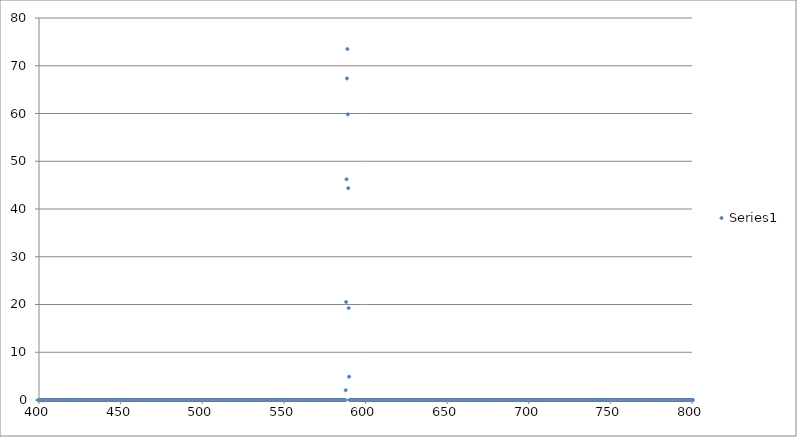
| Category | Series 0 |
|---|---|
| 373.66 | 0 |
| 373.92 | 0 |
| 374.18 | 0 |
| 374.44 | 0 |
| 374.7 | 0 |
| 374.96 | 0 |
| 375.22 | 0 |
| 375.48 | 0 |
| 375.74 | 0 |
| 376.0 | 0 |
| 376.26 | 0 |
| 376.52 | 0 |
| 376.78 | 0 |
| 377.04 | 0 |
| 377.3 | 0 |
| 377.56 | 0 |
| 377.82 | 0 |
| 378.08 | 0 |
| 378.34 | 0 |
| 378.6 | 0 |
| 378.86 | 0 |
| 379.12 | 0 |
| 379.38 | 0 |
| 379.64 | 0 |
| 379.9 | 0 |
| 380.16 | 0 |
| 380.42 | 0 |
| 380.68 | 0 |
| 380.94 | 0 |
| 381.2 | 0 |
| 381.46 | 0 |
| 381.72 | 0 |
| 381.98 | 0 |
| 382.24 | 0 |
| 382.5 | 0 |
| 382.76 | 0 |
| 383.02 | 0 |
| 383.28 | 0 |
| 383.54 | 0 |
| 383.8 | 0 |
| 384.06 | 0 |
| 384.32 | 0 |
| 384.58 | 0 |
| 384.84 | 0 |
| 385.1 | 0 |
| 385.36 | 0 |
| 385.62 | 0 |
| 385.88 | 0 |
| 386.14 | 0 |
| 386.4 | 0 |
| 386.66 | 0 |
| 386.92 | 0 |
| 387.18 | 0 |
| 387.44 | 0 |
| 387.7 | 0 |
| 387.96 | 0 |
| 388.22 | 0 |
| 388.48 | 0 |
| 388.74 | 0 |
| 389.0 | 0 |
| 389.26 | 0 |
| 389.52 | 0 |
| 389.78 | 0 |
| 390.04 | 0 |
| 390.3 | 0 |
| 390.56 | 0 |
| 390.82 | 0 |
| 391.08 | 0 |
| 391.34 | 0 |
| 391.6 | 0 |
| 391.86 | 0 |
| 392.12 | 0 |
| 392.38 | 0 |
| 392.64 | 0 |
| 392.9 | 0 |
| 393.16 | 0 |
| 393.42 | 0 |
| 393.68 | 0 |
| 393.94 | 0 |
| 394.2 | 0 |
| 394.46 | 0 |
| 394.72 | 0 |
| 394.98 | 0 |
| 395.24 | 0 |
| 395.5 | 0 |
| 395.76 | 0 |
| 396.02 | 0 |
| 396.28 | 0 |
| 396.54 | 0 |
| 396.8 | 0 |
| 397.06 | 0 |
| 397.32 | 0 |
| 397.58 | 0 |
| 397.84 | 0 |
| 398.1 | 0 |
| 398.36 | 0 |
| 398.62 | 0 |
| 398.88 | 0 |
| 399.14 | 0 |
| 399.4 | 0 |
| 399.66 | 0 |
| 399.92 | 0 |
| 400.18 | 0 |
| 400.44 | 0 |
| 400.7 | 0 |
| 400.96 | 0 |
| 401.22 | 0 |
| 401.48 | 0 |
| 401.74 | 0 |
| 402.0 | 0 |
| 402.26 | 0 |
| 402.52 | 0 |
| 402.78 | 0 |
| 403.04 | 0 |
| 403.3 | 0 |
| 403.56 | 0 |
| 403.82 | 0 |
| 404.08 | 0 |
| 404.34 | 0 |
| 404.6 | 0 |
| 404.86 | 0 |
| 405.12 | 0 |
| 405.38 | 0 |
| 405.64 | 0 |
| 405.9 | 0 |
| 406.16 | 0 |
| 406.42 | 0 |
| 406.68 | 0 |
| 406.94 | 0 |
| 407.2 | 0 |
| 407.46 | 0 |
| 407.72 | 0 |
| 407.98 | 0 |
| 408.24 | 0 |
| 408.5 | 0 |
| 408.76 | 0 |
| 409.02 | 0 |
| 409.28 | 0 |
| 409.54 | 0 |
| 409.8 | 0 |
| 410.06 | 0 |
| 410.32 | 0 |
| 410.58 | 0 |
| 410.84 | 0 |
| 411.1 | 0 |
| 411.36 | 0 |
| 411.62 | 0 |
| 411.88 | 0 |
| 412.14 | 0 |
| 412.4 | 0 |
| 412.66 | 0 |
| 412.92 | 0 |
| 413.18 | 0 |
| 413.44 | 0 |
| 413.7 | 0 |
| 413.96 | 0 |
| 414.22 | 0 |
| 414.48 | 0 |
| 414.74 | 0 |
| 415.0 | 0 |
| 415.26 | 0 |
| 415.52 | 0 |
| 415.78 | 0 |
| 416.04 | 0 |
| 416.3 | 0 |
| 416.56 | 0 |
| 416.82 | 0 |
| 417.08 | 0 |
| 417.34 | 0 |
| 417.6 | 0 |
| 417.86 | 0 |
| 418.12 | 0 |
| 418.38 | 0 |
| 418.64 | 0 |
| 418.9 | 0 |
| 419.16 | 0 |
| 419.42 | 0 |
| 419.68 | 0 |
| 419.94 | 0 |
| 420.2 | 0 |
| 420.46 | 0 |
| 420.72 | 0 |
| 420.98 | 0 |
| 421.24 | 0 |
| 421.5 | 0 |
| 421.76 | 0 |
| 422.02 | 0 |
| 422.28 | 0 |
| 422.54 | 0 |
| 422.8 | 0 |
| 423.06 | 0 |
| 423.32 | 0 |
| 423.58 | 0 |
| 423.84 | 0 |
| 424.1 | 0 |
| 424.36 | 0 |
| 424.62 | 0 |
| 424.88 | 0 |
| 425.14 | 0 |
| 425.4 | 0 |
| 425.66 | 0 |
| 425.92 | 0 |
| 426.18 | 0 |
| 426.44 | 0 |
| 426.7 | 0 |
| 426.96 | 0 |
| 427.22 | 0 |
| 427.48 | 0 |
| 427.74 | 0 |
| 428.0 | 0 |
| 428.26 | 0 |
| 428.52 | 0 |
| 428.78 | 0 |
| 429.04 | 0 |
| 429.3 | 0 |
| 429.56 | 0 |
| 429.82 | 0 |
| 430.08 | 0 |
| 430.34 | 0 |
| 430.6 | 0 |
| 430.86 | 0 |
| 431.12 | 0 |
| 431.38 | 0 |
| 431.64 | 0 |
| 431.9 | 0 |
| 432.16 | 0 |
| 432.42 | 0 |
| 432.68 | 0 |
| 432.94 | 0 |
| 433.2 | 0 |
| 433.46 | 0 |
| 433.72 | 0 |
| 433.98 | 0 |
| 434.24 | 0 |
| 434.5 | 0 |
| 434.76 | 0 |
| 435.02 | 0 |
| 435.28 | 0 |
| 435.54 | 0 |
| 435.8 | 0 |
| 436.05 | 0 |
| 436.31 | 0 |
| 436.57 | 0 |
| 436.83 | 0 |
| 437.09 | 0 |
| 437.35 | 0 |
| 437.61 | 0 |
| 437.87 | 0 |
| 438.13 | 0 |
| 438.39 | 0 |
| 438.65 | 0 |
| 438.91 | 0 |
| 439.17 | 0 |
| 439.43 | 0 |
| 439.69 | 0 |
| 439.95 | 0 |
| 440.21 | 0 |
| 440.47 | 0 |
| 440.73 | 0 |
| 440.99 | 0 |
| 441.25 | 0 |
| 441.51 | 0 |
| 441.77 | 0 |
| 442.03 | 0 |
| 442.29 | 0 |
| 442.55 | 0 |
| 442.81 | 0 |
| 443.07 | 0 |
| 443.33 | 0 |
| 443.59 | 0 |
| 443.85 | 0 |
| 444.11 | 0 |
| 444.37 | 0 |
| 444.63 | 0 |
| 444.89 | 0 |
| 445.15 | 0 |
| 445.41 | 0 |
| 445.67 | 0 |
| 445.93 | 0 |
| 446.19 | 0 |
| 446.45 | 0 |
| 446.71 | 0 |
| 446.97 | 0 |
| 447.23 | 0 |
| 447.49 | 0 |
| 447.75 | 0 |
| 448.01 | 0 |
| 448.27 | 0 |
| 448.53 | 0 |
| 448.79 | 0 |
| 449.05 | 0 |
| 449.31 | 0 |
| 449.57 | 0 |
| 449.83 | 0 |
| 450.09 | 0 |
| 450.35 | 0 |
| 450.61 | 0 |
| 450.87 | 0 |
| 451.13 | 0 |
| 451.39 | 0 |
| 451.65 | 0 |
| 451.91 | 0 |
| 452.17 | 0 |
| 452.43 | 0 |
| 452.69 | 0 |
| 452.95 | 0 |
| 453.21 | 0 |
| 453.47 | 0 |
| 453.73 | 0 |
| 453.99 | 0 |
| 454.25 | 0 |
| 454.51 | 0 |
| 454.77 | 0 |
| 455.03 | 0 |
| 455.29 | 0 |
| 455.55 | 0 |
| 455.81 | 0 |
| 456.07 | 0 |
| 456.33 | 0 |
| 456.59 | 0 |
| 456.85 | 0 |
| 457.11 | 0 |
| 457.37 | 0 |
| 457.63 | 0 |
| 457.89 | 0 |
| 458.15 | 0 |
| 458.41 | 0 |
| 458.67 | 0 |
| 458.93 | 0 |
| 459.19 | 0 |
| 459.45 | 0 |
| 459.71 | 0 |
| 459.97 | 0 |
| 460.23 | 0 |
| 460.49 | 0 |
| 460.75 | 0 |
| 461.01 | 0 |
| 461.27 | 0 |
| 461.53 | 0 |
| 461.79 | 0 |
| 462.05 | 0 |
| 462.31 | 0 |
| 462.57 | 0 |
| 462.83 | 0 |
| 463.09 | 0 |
| 463.35 | 0 |
| 463.61 | 0 |
| 463.87 | 0 |
| 464.13 | 0 |
| 464.39 | 0 |
| 464.65 | 0 |
| 464.91 | 0 |
| 465.17 | 0 |
| 465.43 | 0 |
| 465.69 | 0 |
| 465.95 | 0 |
| 466.21 | 0 |
| 466.47 | 0 |
| 466.73 | 0 |
| 466.99 | 0 |
| 467.25 | 0 |
| 467.51 | 0 |
| 467.77 | 0 |
| 468.03 | 0 |
| 468.29 | 0 |
| 468.55 | 0 |
| 468.81 | 0 |
| 469.07 | 0 |
| 469.33 | 0 |
| 469.59 | 0 |
| 469.85 | 0 |
| 470.11 | 0 |
| 470.37 | 0 |
| 470.63 | 0 |
| 470.89 | 0 |
| 471.15 | 0 |
| 471.41 | 0 |
| 471.67 | 0 |
| 471.93 | 0 |
| 472.19 | 0 |
| 472.45 | 0 |
| 472.71 | 0 |
| 472.97 | 0 |
| 473.23 | 0 |
| 473.49 | 0 |
| 473.75 | 0 |
| 474.01 | 0 |
| 474.27 | 0 |
| 474.53 | 0 |
| 474.79 | 0 |
| 475.05 | 0 |
| 475.31 | 0 |
| 475.57 | 0 |
| 475.83 | 0 |
| 476.09 | 0 |
| 476.35 | 0 |
| 476.61 | 0 |
| 476.87 | 0 |
| 477.13 | 0 |
| 477.39 | 0 |
| 477.65 | 0 |
| 477.91 | 0 |
| 478.17 | 0 |
| 478.43 | 0 |
| 478.69 | 0 |
| 478.95 | 0 |
| 479.21 | 0 |
| 479.47 | 0 |
| 479.73 | 0 |
| 479.99 | 0 |
| 480.25 | 0 |
| 480.51 | 0 |
| 480.77 | 0 |
| 481.03 | 0 |
| 481.29 | 0 |
| 481.55 | 0 |
| 481.81 | 0 |
| 482.07 | 0 |
| 482.33 | 0 |
| 482.59 | 0 |
| 482.85 | 0 |
| 483.11 | 0 |
| 483.37 | 0 |
| 483.63 | 0 |
| 483.89 | 0 |
| 484.15 | 0 |
| 484.41 | 0 |
| 484.67 | 0 |
| 484.93 | 0 |
| 485.19 | 0 |
| 485.45 | 0 |
| 485.71 | 0 |
| 485.97 | 0 |
| 486.23 | 0 |
| 486.49 | 0 |
| 486.75 | 0 |
| 487.01 | 0 |
| 487.27 | 0 |
| 487.53 | 0 |
| 487.79 | 0 |
| 488.05 | 0 |
| 488.31 | 0 |
| 488.57 | 0 |
| 488.83 | 0 |
| 489.09 | 0 |
| 489.35 | 0 |
| 489.61 | 0 |
| 489.87 | 0 |
| 490.13 | 0 |
| 490.39 | 0 |
| 490.65 | 0 |
| 490.91 | 0 |
| 491.17 | 0 |
| 491.43 | 0 |
| 491.69 | 0 |
| 491.95 | 0 |
| 492.21 | 0 |
| 492.47 | 0 |
| 492.73 | 0 |
| 492.99 | 0 |
| 493.25 | 0 |
| 493.51 | 0 |
| 493.77 | 0 |
| 494.03 | 0 |
| 494.29 | 0 |
| 494.55 | 0 |
| 494.81 | 0 |
| 495.07 | 0 |
| 495.33 | 0 |
| 495.59 | 0 |
| 495.85 | 0 |
| 496.11 | 0 |
| 496.37 | 0 |
| 496.63 | 0 |
| 496.89 | 0 |
| 497.15 | 0 |
| 497.41 | 0 |
| 497.67 | 0 |
| 497.93 | 0 |
| 498.19 | 0 |
| 498.45 | 0 |
| 498.71 | 0 |
| 498.97 | 0 |
| 499.23 | 0 |
| 499.49 | 0 |
| 499.75 | 0 |
| 500.01 | 0 |
| 500.27 | 0 |
| 500.53 | 0 |
| 500.79 | 0 |
| 501.05 | 0 |
| 501.31 | 0 |
| 501.57 | 0 |
| 501.83 | 0 |
| 502.09 | 0 |
| 502.35 | 0 |
| 502.61 | 0 |
| 502.87 | 0 |
| 503.13 | 0 |
| 503.39 | 0 |
| 503.65 | 0 |
| 503.91 | 0 |
| 504.17 | 0 |
| 504.43 | 0 |
| 504.69 | 0 |
| 504.95 | 0 |
| 505.21 | 0 |
| 505.47 | 0 |
| 505.73 | 0 |
| 505.99 | 0 |
| 506.25 | 0 |
| 506.51 | 0 |
| 506.77 | 0 |
| 507.03 | 0 |
| 507.28 | 0 |
| 507.54 | 0 |
| 507.8 | 0 |
| 508.06 | 0 |
| 508.32 | 0 |
| 508.58 | 0 |
| 508.84 | 0 |
| 509.1 | 0 |
| 509.36 | 0 |
| 509.62 | 0 |
| 509.88 | 0 |
| 510.14 | 0 |
| 510.4 | 0 |
| 510.66 | 0 |
| 510.92 | 0 |
| 511.18 | 0 |
| 511.44 | 0 |
| 511.7 | 0 |
| 511.96 | 0 |
| 512.22 | 0 |
| 512.48 | 0 |
| 512.74 | 0 |
| 513.0 | 0 |
| 513.26 | 0 |
| 513.52 | 0 |
| 513.78 | 0 |
| 514.04 | 0 |
| 514.3 | 0 |
| 514.56 | 0 |
| 514.82 | 0 |
| 515.08 | 0 |
| 515.34 | 0 |
| 515.6 | 0 |
| 515.86 | 0 |
| 516.12 | 0 |
| 516.38 | 0 |
| 516.64 | 0 |
| 516.9 | 0 |
| 517.16 | 0 |
| 517.42 | 0 |
| 517.68 | 0 |
| 517.94 | 0 |
| 518.2 | 0 |
| 518.46 | 0 |
| 518.72 | 0 |
| 518.98 | 0 |
| 519.24 | 0 |
| 519.5 | 0 |
| 519.76 | 0 |
| 520.02 | 0 |
| 520.28 | 0 |
| 520.54 | 0 |
| 520.8 | 0 |
| 521.06 | 0 |
| 521.32 | 0 |
| 521.58 | 0 |
| 521.84 | 0 |
| 522.1 | 0 |
| 522.36 | 0 |
| 522.62 | 0 |
| 522.88 | 0 |
| 523.14 | 0 |
| 523.4 | 0 |
| 523.66 | 0 |
| 523.92 | 0 |
| 524.18 | 0 |
| 524.44 | 0 |
| 524.7 | 0 |
| 524.96 | 0 |
| 525.22 | 0 |
| 525.48 | 0 |
| 525.74 | 0 |
| 526.0 | 0 |
| 526.26 | 0 |
| 526.52 | 0 |
| 526.78 | 0 |
| 527.04 | 0 |
| 527.3 | 0 |
| 527.56 | 0 |
| 527.82 | 0 |
| 528.08 | 0 |
| 528.34 | 0 |
| 528.6 | 0 |
| 528.86 | 0 |
| 529.12 | 0 |
| 529.38 | 0 |
| 529.64 | 0 |
| 529.9 | 0 |
| 530.16 | 0 |
| 530.42 | 0 |
| 530.68 | 0 |
| 530.94 | 0 |
| 531.2 | 0 |
| 531.46 | 0 |
| 531.72 | 0 |
| 531.98 | 0 |
| 532.24 | 0 |
| 532.5 | 0 |
| 532.76 | 0 |
| 533.02 | 0 |
| 533.28 | 0 |
| 533.54 | 0 |
| 533.8 | 0 |
| 534.06 | 0 |
| 534.32 | 0 |
| 534.58 | 0 |
| 534.84 | 0 |
| 535.1 | 0 |
| 535.36 | 0 |
| 535.62 | 0 |
| 535.88 | 0 |
| 536.14 | 0 |
| 536.4 | 0 |
| 536.66 | 0 |
| 536.92 | 0 |
| 537.18 | 0 |
| 537.44 | 0 |
| 537.7 | 0 |
| 537.96 | 0 |
| 538.22 | 0 |
| 538.48 | 0 |
| 538.74 | 0 |
| 539.0 | 0 |
| 539.26 | 0 |
| 539.52 | 0 |
| 539.78 | 0 |
| 540.04 | 0 |
| 540.3 | 0 |
| 540.56 | 0 |
| 540.82 | 0 |
| 541.08 | 0 |
| 541.34 | 0 |
| 541.6 | 0 |
| 541.86 | 0 |
| 542.12 | 0 |
| 542.38 | 0 |
| 542.64 | 0 |
| 542.9 | 0 |
| 543.16 | 0 |
| 543.42 | 0 |
| 543.68 | 0 |
| 543.94 | 0 |
| 544.2 | 0 |
| 544.46 | 0 |
| 544.72 | 0 |
| 544.98 | 0 |
| 545.24 | 0 |
| 545.5 | 0 |
| 545.76 | 0 |
| 546.02 | 0 |
| 546.28 | 0 |
| 546.54 | 0 |
| 546.8 | 0 |
| 547.06 | 0 |
| 547.32 | 0 |
| 547.58 | 0 |
| 547.84 | 0 |
| 548.1 | 0 |
| 548.36 | 0 |
| 548.62 | 0 |
| 548.88 | 0 |
| 549.14 | 0 |
| 549.4 | 0 |
| 549.66 | 0 |
| 549.92 | 0 |
| 550.18 | 0 |
| 550.44 | 0 |
| 550.7 | 0 |
| 550.96 | 0 |
| 551.22 | 0 |
| 551.48 | 0 |
| 551.74 | 0 |
| 552.0 | 0 |
| 552.26 | 0 |
| 552.52 | 0 |
| 552.78 | 0 |
| 553.04 | 0 |
| 553.3 | 0 |
| 553.56 | 0 |
| 553.82 | 0 |
| 554.08 | 0 |
| 554.34 | 0 |
| 554.6 | 0 |
| 554.86 | 0 |
| 555.12 | 0 |
| 555.38 | 0 |
| 555.64 | 0 |
| 555.9 | 0 |
| 556.16 | 0 |
| 556.42 | 0 |
| 556.68 | 0 |
| 556.94 | 0 |
| 557.2 | 0 |
| 557.46 | 0 |
| 557.72 | 0 |
| 557.98 | 0 |
| 558.24 | 0 |
| 558.5 | 0 |
| 558.76 | 0 |
| 559.02 | 0 |
| 559.28 | 0 |
| 559.54 | 0 |
| 559.8 | 0 |
| 560.06 | 0 |
| 560.32 | 0 |
| 560.58 | 0 |
| 560.84 | 0 |
| 561.1 | 0 |
| 561.36 | 0 |
| 561.62 | 0 |
| 561.88 | 0 |
| 562.14 | 0 |
| 562.4 | 0 |
| 562.66 | 0 |
| 562.92 | 0 |
| 563.18 | 0 |
| 563.44 | 0 |
| 563.7 | 0 |
| 563.96 | 0 |
| 564.22 | 0 |
| 564.48 | 0 |
| 564.74 | 0 |
| 565.0 | 0 |
| 565.26 | 0 |
| 565.52 | 0 |
| 565.78 | 0 |
| 566.04 | 0 |
| 566.3 | 0 |
| 566.56 | 0 |
| 566.82 | 0 |
| 567.08 | 0 |
| 567.34 | 0 |
| 567.6 | 0 |
| 567.86 | 0 |
| 568.12 | 0 |
| 568.38 | 0 |
| 568.64 | 0 |
| 568.9 | 0 |
| 569.16 | 0 |
| 569.42 | 0 |
| 569.68 | 0 |
| 569.94 | 0 |
| 570.2 | 0 |
| 570.46 | 0 |
| 570.72 | 0 |
| 570.98 | 0 |
| 571.24 | 0 |
| 571.5 | 0 |
| 571.76 | 0 |
| 572.02 | 0 |
| 572.28 | 0 |
| 572.54 | 0 |
| 572.8 | 0 |
| 573.06 | 0 |
| 573.32 | 0 |
| 573.58 | 0 |
| 573.84 | 0 |
| 574.1 | 0 |
| 574.36 | 0 |
| 574.62 | 0 |
| 574.88 | 0 |
| 575.14 | 0 |
| 575.4 | 0 |
| 575.66 | 0 |
| 575.92 | 0 |
| 576.18 | 0 |
| 576.44 | 0 |
| 576.7 | 0 |
| 576.96 | 0 |
| 577.22 | 0 |
| 577.48 | 0 |
| 577.74 | 0 |
| 578.0 | 0 |
| 578.25 | 0 |
| 578.51 | 0 |
| 578.77 | 0 |
| 579.03 | 0 |
| 579.29 | 0 |
| 579.55 | 0 |
| 579.81 | 0 |
| 580.07 | 0 |
| 580.33 | 0 |
| 580.59 | 0 |
| 580.85 | 0 |
| 581.11 | 0 |
| 581.37 | 0 |
| 581.63 | 0 |
| 581.89 | 0 |
| 582.15 | 0 |
| 582.41 | 0 |
| 582.67 | 0 |
| 582.93 | 0 |
| 583.19 | 0 |
| 583.45 | 0 |
| 583.71 | 0 |
| 583.97 | 0 |
| 584.23 | 0 |
| 584.49 | 0 |
| 584.75 | 0 |
| 585.01 | 0 |
| 585.27 | 0 |
| 585.53 | 0 |
| 585.79 | 0 |
| 586.05 | 0 |
| 586.31 | 0 |
| 586.57 | 0 |
| 586.83 | 0 |
| 587.09 | 0 |
| 587.35 | 0 |
| 587.61 | 0 |
| 587.87 | 2.05 |
| 588.13 | 20.52 |
| 588.39 | 46.23 |
| 588.65 | 67.35 |
| 588.91 | 73.5 |
| 589.17 | 59.82 |
| 589.43 | 44.37 |
| 589.69 | 19.25 |
| 589.95 | 4.88 |
| 590.21 | 0 |
| 590.47 | 0 |
| 590.73 | 0 |
| 590.99 | 0 |
| 591.25 | 0 |
| 591.51 | 0 |
| 591.77 | 0 |
| 592.03 | 0 |
| 592.29 | 0 |
| 592.55 | 0 |
| 592.81 | 0 |
| 593.07 | 0 |
| 593.33 | 0 |
| 593.59 | 0 |
| 593.85 | 0 |
| 594.11 | 0 |
| 594.37 | 0 |
| 594.63 | 0 |
| 594.89 | 0 |
| 595.15 | 0 |
| 595.41 | 0 |
| 595.67 | 0 |
| 595.93 | 0 |
| 596.19 | 0 |
| 596.45 | 0 |
| 596.71 | 0 |
| 596.97 | 0 |
| 597.23 | 0 |
| 597.49 | 0 |
| 597.75 | 0 |
| 598.01 | 0 |
| 598.27 | 0 |
| 598.53 | 0 |
| 598.79 | 0 |
| 599.05 | 0 |
| 599.31 | 0 |
| 599.57 | 0 |
| 599.83 | 0 |
| 600.09 | 0 |
| 600.35 | 0 |
| 600.61 | 0 |
| 600.87 | 0 |
| 601.13 | 0 |
| 601.39 | 0 |
| 601.65 | 0 |
| 601.91 | 0 |
| 602.17 | 0 |
| 602.43 | 0 |
| 602.69 | 0 |
| 602.95 | 0 |
| 603.21 | 0 |
| 603.47 | 0 |
| 603.73 | 0 |
| 603.99 | 0 |
| 604.25 | 0 |
| 604.51 | 0 |
| 604.77 | 0 |
| 605.03 | 0 |
| 605.29 | 0 |
| 605.55 | 0 |
| 605.81 | 0 |
| 606.07 | 0 |
| 606.33 | 0 |
| 606.59 | 0 |
| 606.85 | 0 |
| 607.11 | 0 |
| 607.37 | 0 |
| 607.63 | 0 |
| 607.89 | 0 |
| 608.15 | 0 |
| 608.41 | 0 |
| 608.67 | 0 |
| 608.93 | 0 |
| 609.19 | 0 |
| 609.45 | 0 |
| 609.71 | 0 |
| 609.97 | 0 |
| 610.23 | 0 |
| 610.49 | 0 |
| 610.75 | 0 |
| 611.01 | 0 |
| 611.27 | 0 |
| 611.53 | 0 |
| 611.79 | 0 |
| 612.05 | 0 |
| 612.31 | 0 |
| 612.57 | 0 |
| 612.83 | 0 |
| 613.09 | 0 |
| 613.35 | 0 |
| 613.61 | 0 |
| 613.87 | 0 |
| 614.13 | 0 |
| 614.39 | 0 |
| 614.65 | 0 |
| 614.91 | 0 |
| 615.17 | 0 |
| 615.43 | 0 |
| 615.69 | 0 |
| 615.95 | 0 |
| 616.21 | 0 |
| 616.47 | 0 |
| 616.73 | 0 |
| 616.99 | 0 |
| 617.25 | 0 |
| 617.51 | 0 |
| 617.77 | 0 |
| 618.03 | 0 |
| 618.29 | 0 |
| 618.55 | 0 |
| 618.81 | 0 |
| 619.07 | 0 |
| 619.33 | 0 |
| 619.59 | 0 |
| 619.85 | 0 |
| 620.11 | 0 |
| 620.37 | 0 |
| 620.63 | 0 |
| 620.89 | 0 |
| 621.15 | 0 |
| 621.41 | 0 |
| 621.67 | 0 |
| 621.93 | 0 |
| 622.19 | 0 |
| 622.45 | 0 |
| 622.71 | 0 |
| 622.97 | 0 |
| 623.23 | 0 |
| 623.49 | 0 |
| 623.75 | 0 |
| 624.01 | 0 |
| 624.27 | 0 |
| 624.53 | 0 |
| 624.79 | 0 |
| 625.05 | 0 |
| 625.31 | 0 |
| 625.57 | 0 |
| 625.83 | 0 |
| 626.09 | 0 |
| 626.35 | 0 |
| 626.61 | 0 |
| 626.87 | 0 |
| 627.13 | 0 |
| 627.39 | 0 |
| 627.65 | 0 |
| 627.91 | 0 |
| 628.17 | 0 |
| 628.43 | 0 |
| 628.69 | 0 |
| 628.95 | 0 |
| 629.21 | 0 |
| 629.47 | 0 |
| 629.73 | 0 |
| 629.99 | 0 |
| 630.25 | 0 |
| 630.51 | 0 |
| 630.77 | 0 |
| 631.03 | 0 |
| 631.29 | 0 |
| 631.55 | 0 |
| 631.81 | 0 |
| 632.07 | 0 |
| 632.33 | 0 |
| 632.59 | 0 |
| 632.85 | 0 |
| 633.11 | 0 |
| 633.37 | 0 |
| 633.63 | 0 |
| 633.89 | 0 |
| 634.15 | 0 |
| 634.41 | 0 |
| 634.67 | 0 |
| 634.93 | 0 |
| 635.19 | 0 |
| 635.45 | 0 |
| 635.71 | 0 |
| 635.97 | 0 |
| 636.23 | 0 |
| 636.49 | 0 |
| 636.75 | 0 |
| 637.01 | 0 |
| 637.27 | 0 |
| 637.53 | 0 |
| 637.79 | 0 |
| 638.05 | 0 |
| 638.31 | 0 |
| 638.57 | 0 |
| 638.83 | 0 |
| 639.09 | 0 |
| 639.35 | 0 |
| 639.61 | 0 |
| 639.87 | 0 |
| 640.13 | 0 |
| 640.39 | 0 |
| 640.65 | 0 |
| 640.91 | 0 |
| 641.17 | 0 |
| 641.43 | 0 |
| 641.69 | 0 |
| 641.95 | 0 |
| 642.21 | 0 |
| 642.47 | 0 |
| 642.73 | 0 |
| 642.99 | 0 |
| 643.25 | 0 |
| 643.51 | 0 |
| 643.77 | 0 |
| 644.03 | 0 |
| 644.29 | 0 |
| 644.55 | 0 |
| 644.81 | 0 |
| 645.07 | 0 |
| 645.33 | 0 |
| 645.59 | 0 |
| 645.85 | 0 |
| 646.11 | 0 |
| 646.37 | 0 |
| 646.63 | 0 |
| 646.89 | 0 |
| 647.15 | 0 |
| 647.41 | 0 |
| 647.67 | 0 |
| 647.93 | 0 |
| 648.19 | 0 |
| 648.45 | 0 |
| 648.71 | 0 |
| 648.97 | 0 |
| 649.23 | 0 |
| 649.48 | 0 |
| 649.74 | 0 |
| 650.0 | 0 |
| 650.26 | 0 |
| 650.52 | 0 |
| 650.78 | 0 |
| 651.04 | 0 |
| 651.3 | 0 |
| 651.56 | 0 |
| 651.82 | 0 |
| 652.08 | 0 |
| 652.34 | 0 |
| 652.6 | 0 |
| 652.86 | 0 |
| 653.12 | 0 |
| 653.38 | 0 |
| 653.64 | 0 |
| 653.9 | 0 |
| 654.16 | 0 |
| 654.42 | 0 |
| 654.68 | 0 |
| 654.94 | 0 |
| 655.2 | 0 |
| 655.46 | 0 |
| 655.72 | 0 |
| 655.98 | 0 |
| 656.24 | 0 |
| 656.5 | 0 |
| 656.76 | 0 |
| 657.02 | 0 |
| 657.28 | 0 |
| 657.54 | 0 |
| 657.8 | 0 |
| 658.06 | 0 |
| 658.32 | 0 |
| 658.58 | 0 |
| 658.84 | 0 |
| 659.1 | 0 |
| 659.36 | 0 |
| 659.62 | 0 |
| 659.88 | 0 |
| 660.14 | 0 |
| 660.4 | 0 |
| 660.66 | 0 |
| 660.92 | 0 |
| 661.18 | 0 |
| 661.44 | 0 |
| 661.7 | 0 |
| 661.96 | 0 |
| 662.22 | 0 |
| 662.48 | 0 |
| 662.74 | 0 |
| 663.0 | 0 |
| 663.26 | 0 |
| 663.52 | 0 |
| 663.78 | 0 |
| 664.04 | 0 |
| 664.3 | 0 |
| 664.56 | 0 |
| 664.82 | 0 |
| 665.08 | 0 |
| 665.34 | 0 |
| 665.6 | 0 |
| 665.86 | 0 |
| 666.12 | 0 |
| 666.38 | 0 |
| 666.64 | 0 |
| 666.9 | 0 |
| 667.16 | 0 |
| 667.42 | 0 |
| 667.68 | 0 |
| 667.94 | 0 |
| 668.2 | 0 |
| 668.46 | 0 |
| 668.72 | 0 |
| 668.98 | 0 |
| 669.24 | 0 |
| 669.5 | 0 |
| 669.76 | 0 |
| 670.02 | 0 |
| 670.28 | 0 |
| 670.54 | 0 |
| 670.8 | 0 |
| 671.06 | 0 |
| 671.32 | 0 |
| 671.58 | 0 |
| 671.84 | 0 |
| 672.1 | 0 |
| 672.36 | 0 |
| 672.62 | 0 |
| 672.88 | 0 |
| 673.14 | 0 |
| 673.4 | 0 |
| 673.66 | 0 |
| 673.92 | 0 |
| 674.18 | 0 |
| 674.44 | 0 |
| 674.7 | 0 |
| 674.96 | 0 |
| 675.22 | 0 |
| 675.48 | 0 |
| 675.74 | 0 |
| 676.0 | 0 |
| 676.26 | 0 |
| 676.52 | 0 |
| 676.78 | 0 |
| 677.04 | 0 |
| 677.3 | 0 |
| 677.56 | 0 |
| 677.82 | 0 |
| 678.08 | 0 |
| 678.34 | 0 |
| 678.6 | 0 |
| 678.86 | 0 |
| 679.12 | 0 |
| 679.38 | 0 |
| 679.64 | 0 |
| 679.9 | 0 |
| 680.16 | 0 |
| 680.42 | 0 |
| 680.68 | 0 |
| 680.94 | 0 |
| 681.2 | 0 |
| 681.46 | 0 |
| 681.72 | 0 |
| 681.98 | 0 |
| 682.24 | 0 |
| 682.5 | 0 |
| 682.76 | 0 |
| 683.02 | 0 |
| 683.28 | 0 |
| 683.54 | 0 |
| 683.8 | 0 |
| 684.06 | 0 |
| 684.32 | 0 |
| 684.58 | 0 |
| 684.84 | 0 |
| 685.1 | 0 |
| 685.36 | 0 |
| 685.62 | 0 |
| 685.88 | 0 |
| 686.14 | 0 |
| 686.4 | 0 |
| 686.66 | 0 |
| 686.92 | 0 |
| 687.18 | 0 |
| 687.44 | 0 |
| 687.7 | 0 |
| 687.96 | 0 |
| 688.22 | 0 |
| 688.48 | 0 |
| 688.74 | 0 |
| 689.0 | 0 |
| 689.26 | 0 |
| 689.52 | 0 |
| 689.78 | 0 |
| 690.04 | 0 |
| 690.3 | 0 |
| 690.56 | 0 |
| 690.82 | 0 |
| 691.08 | 0 |
| 691.34 | 0 |
| 691.6 | 0 |
| 691.86 | 0 |
| 692.12 | 0 |
| 692.38 | 0 |
| 692.64 | 0 |
| 692.9 | 0 |
| 693.16 | 0 |
| 693.42 | 0 |
| 693.68 | 0 |
| 693.94 | 0 |
| 694.2 | 0 |
| 694.46 | 0 |
| 694.72 | 0 |
| 694.98 | 0 |
| 695.24 | 0 |
| 695.5 | 0 |
| 695.76 | 0 |
| 696.02 | 0 |
| 696.28 | 0 |
| 696.54 | 0 |
| 696.8 | 0 |
| 697.06 | 0 |
| 697.32 | 0 |
| 697.58 | 0 |
| 697.84 | 0 |
| 698.1 | 0 |
| 698.36 | 0 |
| 698.62 | 0 |
| 698.88 | 0 |
| 699.14 | 0 |
| 699.4 | 0 |
| 699.66 | 0 |
| 699.92 | 0 |
| 700.18 | 0 |
| 700.44 | 0 |
| 700.7 | 0 |
| 700.96 | 0 |
| 701.22 | 0 |
| 701.48 | 0 |
| 701.74 | 0 |
| 702.0 | 0 |
| 702.26 | 0 |
| 702.52 | 0 |
| 702.78 | 0 |
| 703.04 | 0 |
| 703.3 | 0 |
| 703.56 | 0 |
| 703.82 | 0 |
| 704.08 | 0 |
| 704.34 | 0 |
| 704.6 | 0 |
| 704.86 | 0 |
| 705.12 | 0 |
| 705.38 | 0 |
| 705.64 | 0 |
| 705.9 | 0 |
| 706.16 | 0 |
| 706.42 | 0 |
| 706.68 | 0 |
| 706.94 | 0 |
| 707.2 | 0 |
| 707.46 | 0 |
| 707.72 | 0 |
| 707.98 | 0 |
| 708.24 | 0 |
| 708.5 | 0 |
| 708.76 | 0 |
| 709.02 | 0 |
| 709.28 | 0 |
| 709.54 | 0 |
| 709.8 | 0 |
| 710.06 | 0 |
| 710.32 | 0 |
| 710.58 | 0 |
| 710.84 | 0 |
| 711.1 | 0 |
| 711.36 | 0 |
| 711.62 | 0 |
| 711.88 | 0 |
| 712.14 | 0 |
| 712.4 | 0 |
| 712.66 | 0 |
| 712.92 | 0 |
| 713.18 | 0 |
| 713.44 | 0 |
| 713.7 | 0 |
| 713.96 | 0 |
| 714.22 | 0 |
| 714.48 | 0 |
| 714.74 | 0 |
| 715.0 | 0 |
| 715.26 | 0 |
| 715.52 | 0 |
| 715.78 | 0 |
| 716.04 | 0 |
| 716.3 | 0 |
| 716.56 | 0 |
| 716.82 | 0 |
| 717.08 | 0 |
| 717.34 | 0 |
| 717.6 | 0 |
| 717.86 | 0 |
| 718.12 | 0 |
| 718.38 | 0 |
| 718.64 | 0 |
| 718.9 | 0 |
| 719.16 | 0 |
| 719.42 | 0 |
| 719.68 | 0 |
| 719.94 | 0 |
| 720.2 | 0 |
| 720.45 | 0 |
| 720.71 | 0 |
| 720.97 | 0 |
| 721.23 | 0 |
| 721.49 | 0 |
| 721.75 | 0 |
| 722.01 | 0 |
| 722.27 | 0 |
| 722.53 | 0 |
| 722.79 | 0 |
| 723.05 | 0 |
| 723.31 | 0 |
| 723.57 | 0 |
| 723.83 | 0 |
| 724.09 | 0 |
| 724.35 | 0 |
| 724.61 | 0 |
| 724.87 | 0 |
| 725.13 | 0 |
| 725.39 | 0 |
| 725.65 | 0 |
| 725.91 | 0 |
| 726.17 | 0 |
| 726.43 | 0 |
| 726.69 | 0 |
| 726.95 | 0 |
| 727.21 | 0 |
| 727.47 | 0 |
| 727.73 | 0 |
| 727.99 | 0 |
| 728.25 | 0 |
| 728.51 | 0 |
| 728.77 | 0 |
| 729.03 | 0 |
| 729.29 | 0 |
| 729.55 | 0 |
| 729.81 | 0 |
| 730.07 | 0 |
| 730.33 | 0 |
| 730.59 | 0 |
| 730.85 | 0 |
| 731.11 | 0 |
| 731.37 | 0 |
| 731.63 | 0 |
| 731.89 | 0 |
| 732.15 | 0 |
| 732.41 | 0 |
| 732.67 | 0 |
| 732.93 | 0 |
| 733.19 | 0 |
| 733.45 | 0 |
| 733.71 | 0 |
| 733.97 | 0 |
| 734.23 | 0 |
| 734.49 | 0 |
| 734.75 | 0 |
| 735.01 | 0 |
| 735.27 | 0 |
| 735.53 | 0 |
| 735.79 | 0 |
| 736.05 | 0 |
| 736.31 | 0 |
| 736.57 | 0 |
| 736.83 | 0 |
| 737.09 | 0 |
| 737.35 | 0 |
| 737.61 | 0 |
| 737.87 | 0 |
| 738.13 | 0 |
| 738.39 | 0 |
| 738.65 | 0 |
| 738.91 | 0 |
| 739.17 | 0 |
| 739.43 | 0 |
| 739.69 | 0 |
| 739.95 | 0 |
| 740.21 | 0 |
| 740.47 | 0 |
| 740.73 | 0 |
| 740.99 | 0 |
| 741.25 | 0 |
| 741.51 | 0 |
| 741.77 | 0 |
| 742.03 | 0 |
| 742.29 | 0 |
| 742.55 | 0 |
| 742.81 | 0 |
| 743.07 | 0 |
| 743.33 | 0 |
| 743.59 | 0 |
| 743.85 | 0 |
| 744.11 | 0 |
| 744.37 | 0 |
| 744.63 | 0 |
| 744.89 | 0 |
| 745.15 | 0 |
| 745.41 | 0 |
| 745.67 | 0 |
| 745.93 | 0 |
| 746.19 | 0 |
| 746.45 | 0 |
| 746.71 | 0 |
| 746.97 | 0 |
| 747.23 | 0 |
| 747.49 | 0 |
| 747.75 | 0 |
| 748.01 | 0 |
| 748.27 | 0 |
| 748.53 | 0 |
| 748.79 | 0 |
| 749.05 | 0 |
| 749.31 | 0 |
| 749.57 | 0 |
| 749.83 | 0 |
| 750.09 | 0 |
| 750.35 | 0 |
| 750.61 | 0 |
| 750.87 | 0 |
| 751.13 | 0 |
| 751.39 | 0 |
| 751.65 | 0 |
| 751.91 | 0 |
| 752.17 | 0 |
| 752.43 | 0 |
| 752.69 | 0 |
| 752.95 | 0 |
| 753.21 | 0 |
| 753.47 | 0 |
| 753.73 | 0 |
| 753.99 | 0 |
| 754.25 | 0 |
| 754.51 | 0 |
| 754.77 | 0 |
| 755.03 | 0 |
| 755.29 | 0 |
| 755.55 | 0 |
| 755.81 | 0 |
| 756.07 | 0 |
| 756.33 | 0 |
| 756.59 | 0 |
| 756.85 | 0 |
| 757.11 | 0 |
| 757.37 | 0 |
| 757.63 | 0 |
| 757.89 | 0 |
| 758.15 | 0 |
| 758.41 | 0 |
| 758.67 | 0 |
| 758.93 | 0 |
| 759.19 | 0 |
| 759.45 | 0 |
| 759.71 | 0 |
| 759.97 | 0 |
| 760.23 | 0 |
| 760.49 | 0 |
| 760.75 | 0 |
| 761.01 | 0 |
| 761.27 | 0 |
| 761.53 | 0 |
| 761.79 | 0 |
| 762.05 | 0 |
| 762.31 | 0 |
| 762.57 | 0 |
| 762.83 | 0 |
| 763.09 | 0 |
| 763.35 | 0 |
| 763.61 | 0 |
| 763.87 | 0 |
| 764.13 | 0 |
| 764.39 | 0 |
| 764.65 | 0 |
| 764.91 | 0 |
| 765.17 | 0 |
| 765.43 | 0 |
| 765.69 | 0 |
| 765.95 | 0 |
| 766.21 | 0 |
| 766.47 | 0 |
| 766.73 | 0 |
| 766.99 | 0 |
| 767.25 | 0 |
| 767.51 | 0 |
| 767.77 | 0 |
| 768.03 | 0 |
| 768.29 | 0 |
| 768.55 | 0 |
| 768.81 | 0 |
| 769.07 | 0 |
| 769.33 | 0 |
| 769.59 | 0 |
| 769.85 | 0 |
| 770.11 | 0 |
| 770.37 | 0 |
| 770.63 | 0 |
| 770.89 | 0 |
| 771.15 | 0 |
| 771.41 | 0 |
| 771.67 | 0 |
| 771.93 | 0 |
| 772.19 | 0 |
| 772.45 | 0 |
| 772.71 | 0 |
| 772.97 | 0 |
| 773.23 | 0 |
| 773.49 | 0 |
| 773.75 | 0 |
| 774.01 | 0 |
| 774.27 | 0 |
| 774.53 | 0 |
| 774.79 | 0 |
| 775.05 | 0 |
| 775.31 | 0 |
| 775.57 | 0 |
| 775.83 | 0 |
| 776.09 | 0 |
| 776.35 | 0 |
| 776.61 | 0 |
| 776.87 | 0 |
| 777.13 | 0 |
| 777.39 | 0 |
| 777.65 | 0 |
| 777.91 | 0 |
| 778.17 | 0 |
| 778.43 | 0 |
| 778.69 | 0 |
| 778.95 | 0 |
| 779.21 | 0 |
| 779.47 | 0 |
| 779.73 | 0 |
| 779.99 | 0 |
| 780.25 | 0 |
| 780.51 | 0 |
| 780.77 | 0 |
| 781.03 | 0 |
| 781.29 | 0 |
| 781.55 | 0 |
| 781.81 | 0 |
| 782.07 | 0 |
| 782.33 | 0 |
| 782.59 | 0 |
| 782.85 | 0 |
| 783.11 | 0 |
| 783.37 | 0 |
| 783.63 | 0 |
| 783.89 | 0 |
| 784.15 | 0 |
| 784.41 | 0 |
| 784.67 | 0 |
| 784.93 | 0 |
| 785.19 | 0 |
| 785.45 | 0 |
| 785.71 | 0 |
| 785.97 | 0 |
| 786.23 | 0 |
| 786.49 | 0 |
| 786.75 | 0 |
| 787.01 | 0 |
| 787.27 | 0 |
| 787.53 | 0 |
| 787.79 | 0 |
| 788.05 | 0 |
| 788.31 | 0 |
| 788.57 | 0 |
| 788.83 | 0 |
| 789.09 | 0 |
| 789.35 | 0 |
| 789.61 | 0 |
| 789.87 | 0 |
| 790.13 | 0 |
| 790.39 | 0 |
| 790.65 | 0 |
| 790.91 | 0 |
| 791.17 | 0 |
| 791.43 | 0 |
| 791.68 | 0 |
| 791.94 | 0 |
| 792.2 | 0 |
| 792.46 | 0 |
| 792.72 | 0 |
| 792.98 | 0 |
| 793.24 | 0 |
| 793.5 | 0 |
| 793.76 | 0 |
| 794.02 | 0 |
| 794.28 | 0 |
| 794.54 | 0 |
| 794.8 | 0 |
| 795.06 | 0 |
| 795.32 | 0 |
| 795.58 | 0 |
| 795.84 | 0 |
| 796.1 | 0 |
| 796.36 | 0 |
| 796.62 | 0 |
| 796.88 | 0 |
| 797.14 | 0 |
| 797.4 | 0 |
| 797.66 | 0 |
| 797.92 | 0 |
| 798.18 | 0 |
| 798.44 | 0 |
| 798.7 | 0 |
| 798.96 | 0 |
| 799.22 | 0 |
| 799.48 | 0 |
| 799.74 | 0 |
| 800.0 | 0 |
| 800.26 | 0 |
| 800.52 | 0 |
| 800.78 | 0 |
| 801.04 | 0 |
| 801.3 | 0 |
| 801.56 | 0 |
| 801.82 | 0 |
| 802.08 | 0 |
| 802.34 | 0 |
| 802.6 | 0 |
| 802.86 | 0 |
| 803.12 | 0 |
| 803.38 | 0 |
| 803.64 | 0 |
| 803.9 | 0 |
| 804.16 | 0 |
| 804.42 | 0 |
| 804.68 | 0 |
| 804.94 | 0 |
| 805.2 | 0 |
| 805.46 | 0 |
| 805.72 | 0 |
| 805.98 | 0 |
| 806.24 | 0 |
| 806.5 | 0 |
| 806.76 | 0 |
| 807.02 | 0 |
| 807.28 | 0 |
| 807.54 | 0 |
| 807.8 | 0 |
| 808.06 | 0 |
| 808.32 | 0 |
| 808.58 | 0 |
| 808.84 | 0 |
| 809.1 | 0 |
| 809.36 | 0 |
| 809.62 | 0 |
| 809.88 | 0 |
| 810.14 | 0 |
| 810.4 | 0 |
| 810.66 | 0 |
| 810.92 | 0 |
| 811.18 | 0 |
| 811.44 | 0 |
| 811.7 | 0 |
| 811.96 | 0 |
| 812.22 | 0 |
| 812.48 | 0 |
| 812.74 | 0 |
| 813.0 | 0 |
| 813.26 | 0 |
| 813.52 | 0 |
| 813.78 | 0 |
| 814.04 | 0 |
| 814.3 | 0 |
| 814.56 | 0 |
| 814.82 | 0 |
| 815.08 | 0 |
| 815.34 | 0 |
| 815.6 | 0 |
| 815.86 | 0 |
| 816.12 | 0 |
| 816.38 | 0 |
| 816.64 | 0 |
| 816.9 | 0 |
| 817.16 | 0 |
| 817.42 | 0 |
| 817.68 | 0 |
| 817.94 | 0 |
| 818.2 | 0 |
| 818.46 | 0 |
| 818.72 | 0 |
| 818.98 | 0 |
| 819.24 | 0 |
| 819.5 | 0 |
| 819.76 | 0 |
| 820.02 | 0 |
| 820.28 | 0 |
| 820.54 | 0 |
| 820.8 | 0 |
| 821.06 | 0 |
| 821.32 | 0 |
| 821.58 | 0 |
| 821.84 | 0 |
| 822.1 | 0 |
| 822.36 | 0 |
| 822.62 | 0 |